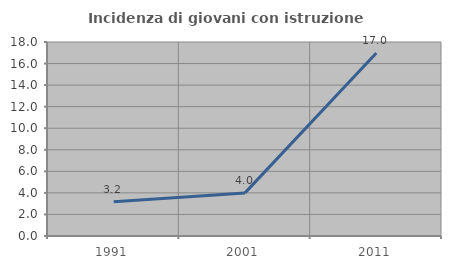
| Category | Incidenza di giovani con istruzione universitaria |
|---|---|
| 1991.0 | 3.175 |
| 2001.0 | 4 |
| 2011.0 | 16.981 |